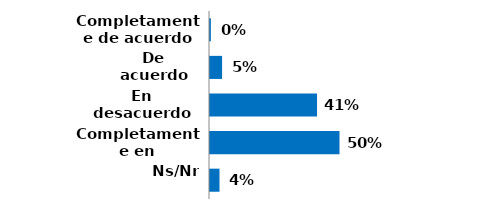
| Category | Series 0 |
|---|---|
| Completamente de acuerdo | 0.003 |
| De acuerdo | 0.047 |
| En desacuerdo | 0.413 |
| Completamente en desacuerdo | 0.5 |
| Ns/Nr | 0.037 |